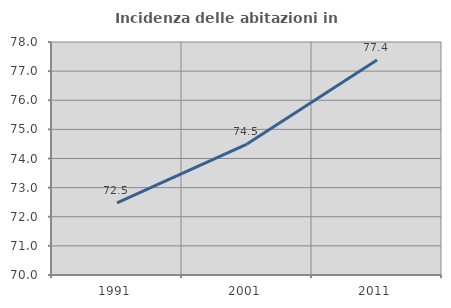
| Category | Incidenza delle abitazioni in proprietà  |
|---|---|
| 1991.0 | 72.479 |
| 2001.0 | 74.495 |
| 2011.0 | 77.379 |